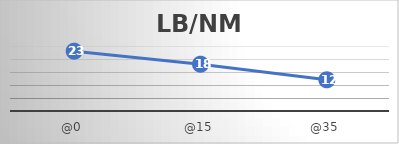
| Category | LB/NM |
|---|---|
| @0 | 23 |
| @15 | 18 |
| @35 | 12 |